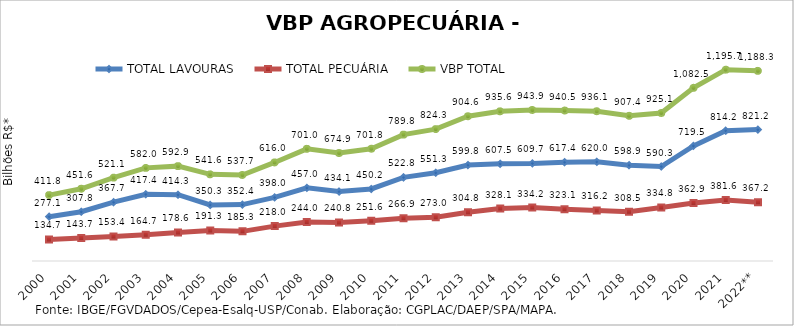
| Category | TOTAL LAVOURAS | TOTAL PECUÁRIA | VBP TOTAL |
|---|---|---|---|
| 2000 | 277.125 | 134.708 | 411.833 |
| 2001 | 307.835 | 143.716 | 451.551 |
| 2002 | 367.72 | 153.418 | 521.138 |
| 2003 | 417.359 | 164.668 | 582.027 |
| 2004 | 414.303 | 178.617 | 592.92 |
| 2005 | 350.275 | 191.342 | 541.617 |
| 2006 | 352.415 | 185.317 | 537.732 |
| 2007 | 397.988 | 218.016 | 616.004 |
| 2008 | 456.989 | 244.011 | 701 |
| 2009 | 434.079 | 240.838 | 674.916 |
| 2010 | 450.187 | 251.629 | 701.816 |
| 2011 | 522.837 | 266.914 | 789.751 |
| 2012 | 551.268 | 273.037 | 824.305 |
| 2013 | 599.784 | 304.812 | 904.596 |
| 2014 | 607.5 | 328.065 | 935.565 |
| 2015 | 609.705 | 334.209 | 943.913 |
| 2016 | 617.414 | 323.096 | 940.51 |
| 2017 | 619.978 | 316.154 | 936.132 |
| 2018 | 598.864 | 308.508 | 907.371 |
| 2019 | 590.252 | 334.819 | 925.071 |
| 2020 | 719.531 | 362.923 | 1082.453 |
| 2021 | 814.166 | 381.57 | 1195.737 |
| 2022** | 821.175 | 367.165 | 1188.34 |